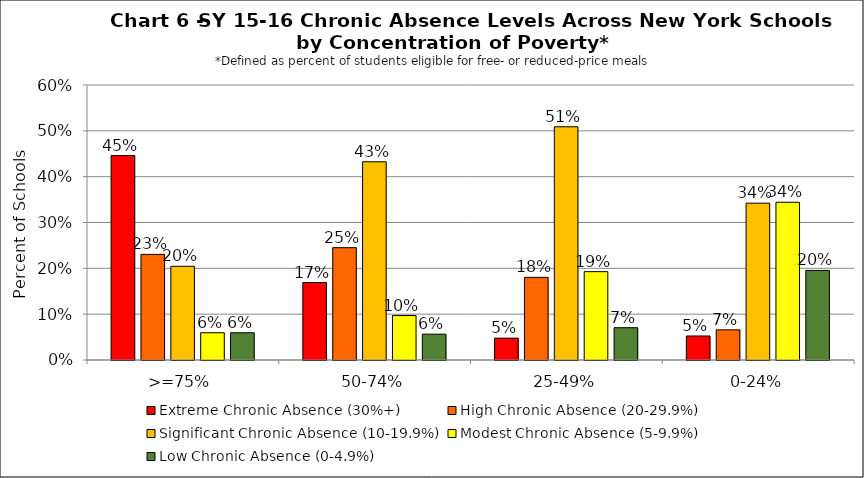
| Category | Extreme Chronic Absence (30%+) | High Chronic Absence (20-29.9%) | Significant Chronic Absence (10-19.9%) | Modest Chronic Absence (5-9.9%) | Low Chronic Absence (0-4.9%) |
|---|---|---|---|---|---|
| 0 | 0.446 | 0.23 | 0.204 | 0.059 | 0.059 |
| 1 | 0.169 | 0.245 | 0.433 | 0.097 | 0.056 |
| 2 | 0.048 | 0.18 | 0.509 | 0.193 | 0.07 |
| 3 | 0.052 | 0.066 | 0.342 | 0.344 | 0.195 |